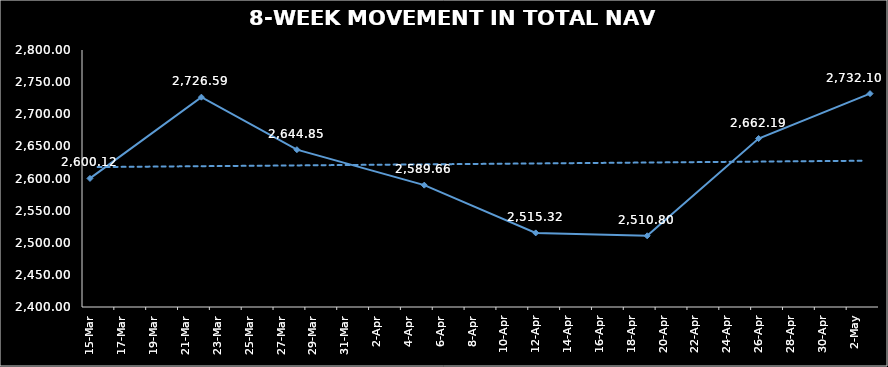
| Category | TOTAL NAV |
|---|---|
| 2024-03-15 | 2600.12 |
| 2024-03-22 | 2726.59 |
| 2024-03-28 | 2644.848 |
| 2024-04-05 | 2589.664 |
| 2024-04-12 | 2515.322 |
| 2024-04-19 | 2510.798 |
| 2024-04-26 | 2662.194 |
| 2024-05-03 | 2732.096 |